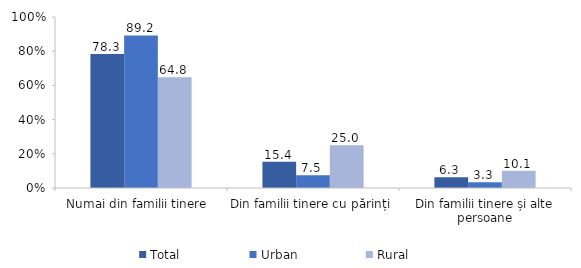
| Category | Total | Urban | Rural |
|---|---|---|---|
| Numai din familii tinere  | 78.3 | 89.2 | 64.8 |
| Din familii tinere cu părinți | 15.4 | 7.5 | 25 |
| Din familii tinere și alte persoane | 6.3 | 3.3 | 10.1 |